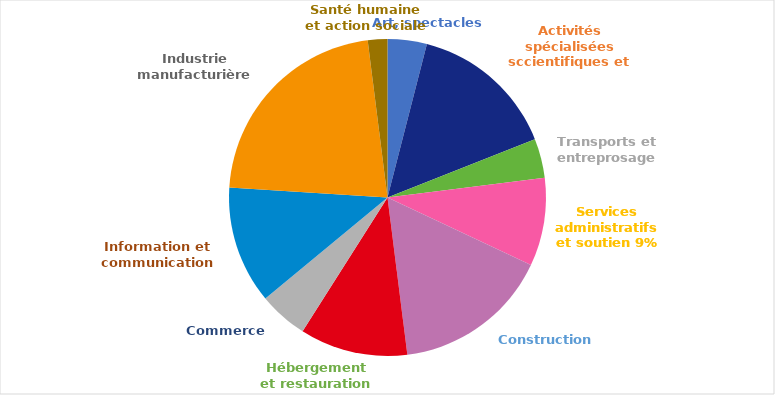
| Category | Series 0 |
|---|---|
| Art, spectacles | 0.04 |
| Activités spécialisées sccientifiques et techniques  | 0.15 |
| Transports et entreprosage | 0.04 |
| Services administratifs et soutien | 0.09 |
| Construction | 0.16 |
| Hébergement et restauration | 0.11 |
| Commerce | 0.05 |
| Information et communication | 0.12 |
| Industrie manufacturière | 0.22 |
| Santé humaine et action sociale | 0.02 |